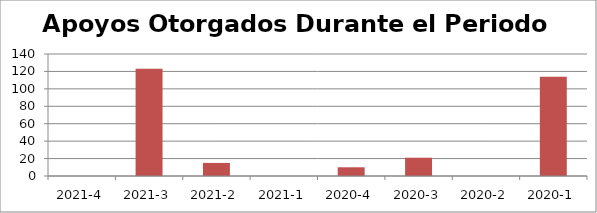
| Category | Referencia de Apoyos Otorgados Durante el Periodo Trimestral |
|---|---|
| 2021-4 | 0 |
| 2021-3 | 123 |
| 2021-2 | 15 |
| 2021-1 | 0 |
| 2020-4 | 10 |
| 2020-3 | 21 |
| 2020-2 | 0 |
| 2020-1 | 114 |